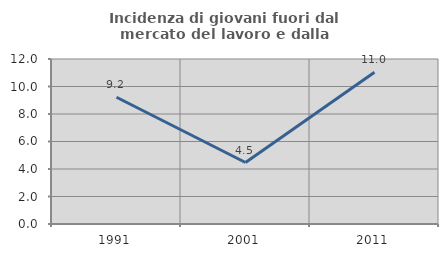
| Category | Incidenza di giovani fuori dal mercato del lavoro e dalla formazione  |
|---|---|
| 1991.0 | 9.22 |
| 2001.0 | 4.472 |
| 2011.0 | 11.039 |